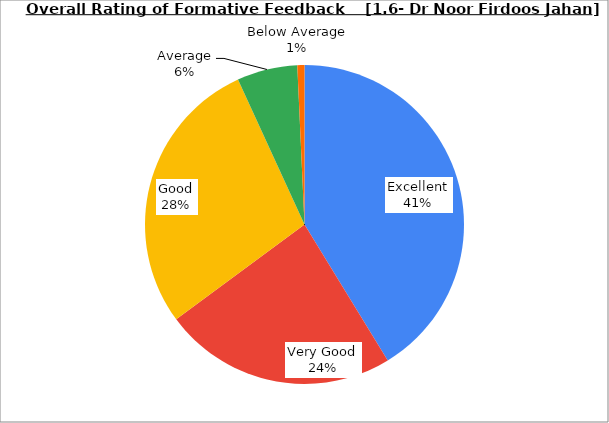
| Category | Series 0 |
|---|---|
| Excellent | 41.261 |
| Very Good | 23.604 |
| Good | 28.288 |
| Average | 6.126 |
| Below Average | 0.721 |